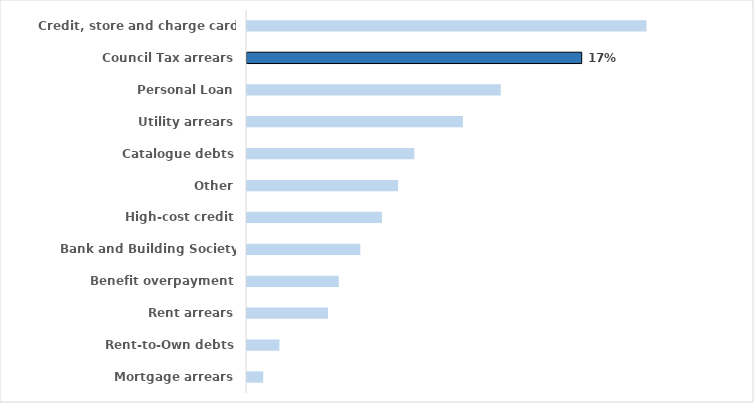
| Category | 2019/20 |
|---|---|
| Mortgage arrears | 0.008 |
| Rent-to-Own debts | 0.016 |
| Rent arrears | 0.041 |
| Benefit overpayment | 0.046 |
| Bank and Building Society overdrafts | 0.057 |
| High-cost credit | 0.068 |
| Other | 0.076 |
| Catalogue debts | 0.084 |
| Utility arrears | 0.108 |
| Personal Loan | 0.127 |
| Council Tax arrears | 0.168 |
| Credit, store and charge card debts | 0.201 |